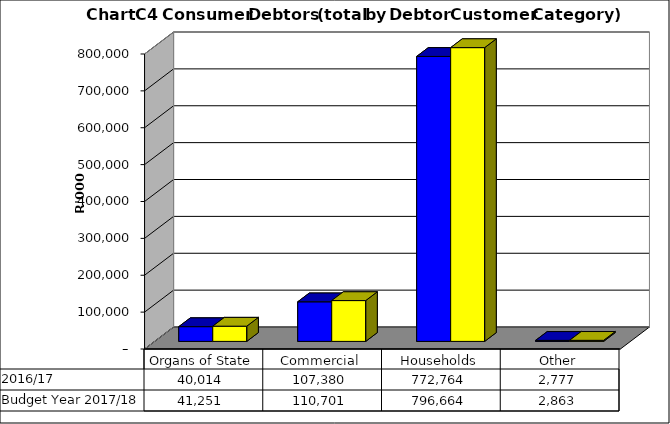
| Category |  2016/17  | Budget Year 2017/18 |
|---|---|---|
| Organs of State | 40013554.118 | 41251086.72 |
| Commercial | 107379907.745 | 110700935.82 |
| Households | 772764079.952 | 796663999.95 |
| Other | 2777053.032 | 2862941.27 |